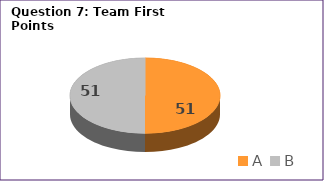
| Category | Series 0 |
|---|---|
| A | 51 |
| B | 51 |